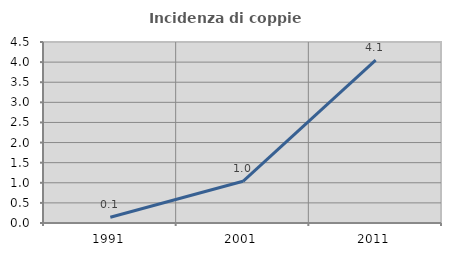
| Category | Incidenza di coppie miste |
|---|---|
| 1991.0 | 0.143 |
| 2001.0 | 1.036 |
| 2011.0 | 4.051 |